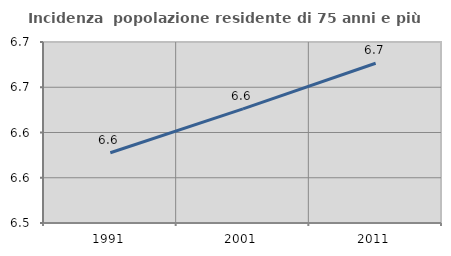
| Category | Incidenza  popolazione residente di 75 anni e più |
|---|---|
| 1991.0 | 6.578 |
| 2001.0 | 6.626 |
| 2011.0 | 6.677 |